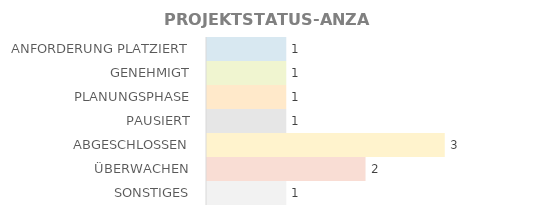
| Category | MENGE |
|---|---|
| ANFORDERUNG PLATZIERT | 1 |
| GENEHMIGT | 1 |
| PLANUNGSPHASE | 1 |
| PAUSIERT | 1 |
| ABGESCHLOSSEN | 3 |
| ÜBERWACHEN | 2 |
| SONSTIGES | 1 |